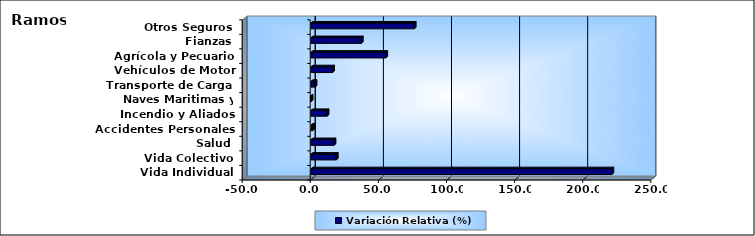
| Category | Variación Relativa (%) |
|---|---|
| Vida Individual | 220.847 |
| Vida Colectivo | 18.491 |
| Salud | 16.808 |
| Accidentes Personales | 1.083 |
| Incendio y Aliados | 11.7 |
| Naves Maritimas y Aéreas | -0.344 |
| Transporte de Carga | 2.914 |
| Vehículos de Motor | 15.757 |
| Agrícola y Pecuario | 54.818 |
| Fianzas | 36.852 |
| Otros Seguros | 75.72 |